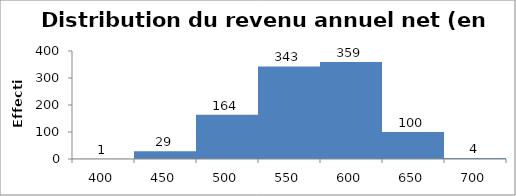
| Category | Fréquence |
|---|---|
| 400.0 | 1 |
| 450.0 | 29 |
| 500.0 | 164 |
| 550.0 | 343 |
| 600.0 | 359 |
| 650.0 | 100 |
| 700.0 | 4 |